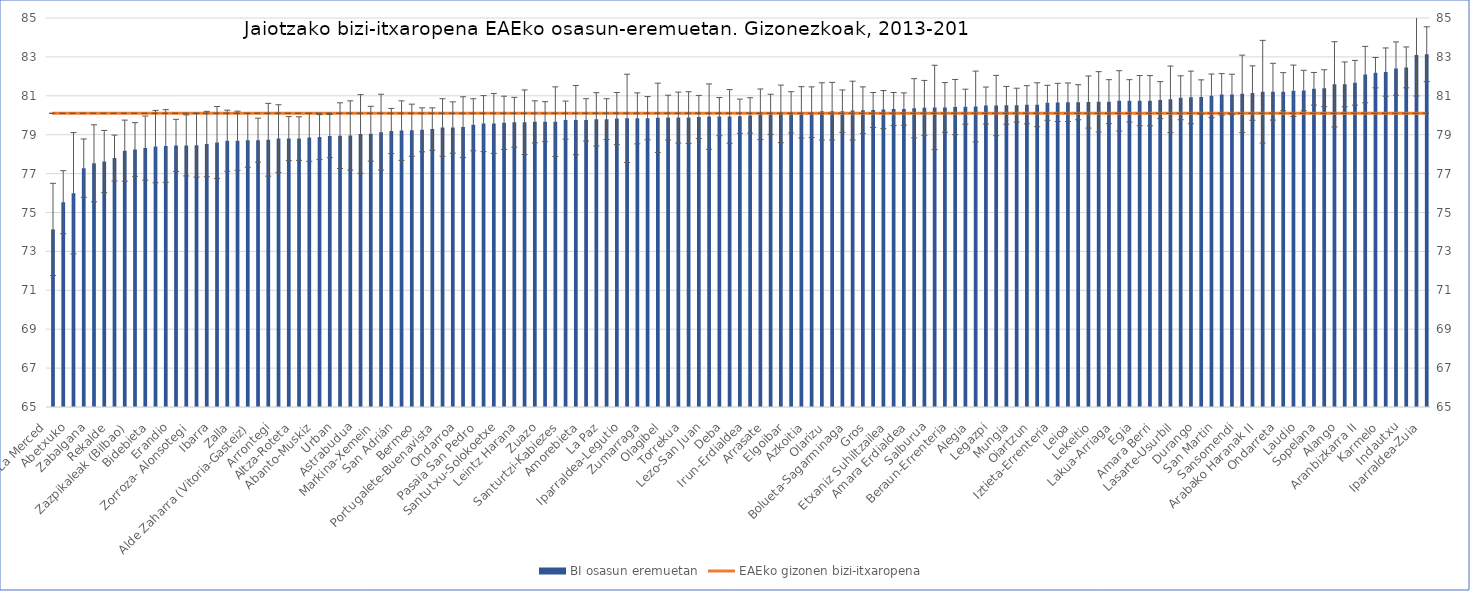
| Category | Osasun Eremua | BI osasun eremuetan |
|---|---|---|
| La Merced  | 0 | 74.13 |
| Miribilla  | 0 | 75.53 |
| Abetxuko  | 0 | 75.99 |
| Otxarkoaga  | 0 | 77.28 |
| Zabalgana  | 0 | 77.53 |
| Abusu  | 0 | 77.62 |
| Rekalde  | 0 | 77.8 |
| Larreagaburu  | 0 | 78.18 |
| Zazpikaleak (Bilbao)  | 0 | 78.24 |
| Pasaia Antxo  | 0 | 78.31 |
| Bidebieta  | 0 | 78.39 |
| Zaramaga  | 0 | 78.42 |
| Erandio  | 0 | 78.45 |
| Intxaurrondo  | 0 | 78.45 |
| Zorroza- Alonsotegi  | 0 | 78.46 |
| Lutxana  | 0 | 78.52 |
| Ibarra  | 0 | 78.6 |
| Sodupe-Gueñes  | 0 | 78.69 |
| Zalla  | 0 | 78.69 |
| Trapagaran  | 0 | 78.71 |
| Alde Zaharra (Vitoria-Gasteiz)  | 0 | 78.72 |
| Ortuella  | 0 | 78.74 |
| Arrontegi  | 0 | 78.8 |
| Tolosa  | 0 | 78.8 |
| Altza-Roteta  | 0 | 78.8 |
| Azpeitia  | 0 | 78.86 |
| Abanto-Muskiz  | 0 | 78.88 |
| Markonzaga  | 0 | 78.93 |
| Urban  | 0 | 78.95 |
| Loiola  | 0 | 78.96 |
| Astrabudua  | 0 | 79.04 |
| Villabona  | 0 | 79.05 |
| Markina-Xemein  | 0 | 79.13 |
| Santurtzi-Erdialdea-Mamariga  | 0 | 79.19 |
| San Adrián  | 0 | 79.21 |
| Ordizia  | 0 | 79.23 |
| Bermeo  | 0 | 79.25 |
| Zumaia-Zestoa-Getaria  | 0 | 79.29 |
| Portugalete-Buenavista  | 0 | 79.37 |
| Kueto  | 0 | 79.37 |
| Ondarroa  | 0 | 79.39 |
| Zaballa  | 0 | 79.51 |
| Pasaia San Pedro  | 0 | 79.57 |
| Arabako Errioxa  | 0 | 79.58 |
| Santutxu-Solokoetxe  | 0 | 79.61 |
| Txurdinaga  | 0 | 79.64 |
| Leintz Harana  | 0 | 79.64 |
| San Vicente  | 0 | 79.66 |
| Zuazo  | 0 | 79.67 |
| Begoña  | 0 | 79.67 |
| Santurtzi-Kabiezes  | 0 | 79.75 |
| Lazkao  | 0 | 79.75 |
| Amorebieta  | 0 | 79.76 |
| Arratia  | 0 | 79.79 |
| La Paz  | 0 | 79.8 |
| Balmaseda  | 0 | 79.83 |
| Iparraldea-Legutio  | 0 | 79.84 |
| Portugalete-Errepelega  | 0 | 79.84 |
| Zumarraga  | 0 | 79.85 |
| Zurbaran  | 0 | 79.87 |
| Olagibel  | 0 | 79.88 |
| Eibar  | 0 | 79.88 |
| Torrekua  | 0 | 79.88 |
| Basauri-Ariz  | 0 | 79.91 |
| Lezo-San Juan  | 0 | 79.93 |
| Dumboa  | 0 | 79.93 |
| Deba  | 0 | 79.94 |
| Hernani-Urnieta-Astigarraga  | 0 | 79.95 |
| Irun-Erdialdea  | 0 | 79.99 |
| Basauri-Kareaga  | 0 | 80.05 |
| Arrasate  | 0 | 80.05 |
| Etxebarri  | 0 | 80.07 |
| Elgoibar  | 0 | 80.15 |
| Andoain  | 0 | 80.15 |
| Azkoitia  | 0 | 80.16 |
| Hondarribia  | 0 | 80.2 |
| Olarizu  | 0 | 80.21 |
| Deustu  | 0 | 80.21 |
| Bolueta-Sagarminaga  | 0 | 80.24 |
| Gernika  | 0 | 80.26 |
| Gros  | 0 | 80.27 |
| Abadiño-Elorrio-Berriz  | 0 | 80.29 |
| Etxaniz Suhiltzailea  | 0 | 80.32 |
| Areeta  | 0 | 80.32 |
| Amara Erdialdea  | 0 | 80.36 |
| Gernikaldea  | 0 | 80.38 |
| Salburua  | 0 | 80.4 |
| Ermua  | 0 | 80.4 |
| Beraun-Errenteria  | 0 | 80.42 |
| Galdakao  | 0 | 80.44 |
| Alegia  | 0 | 80.45 |
| Aiala  | 0 | 80.5 |
| Legazpi  | 0 | 80.5 |
| Gazteleku  | 0 | 80.51 |
| Mungia  | 0 | 80.52 |
| Basurtu  | 0 | 80.54 |
| Oiartzun  | 0 | 80.54 |
| San Inazio  | 0 | 80.64 |
| Iztieta-Errenteria  | 0 | 80.66 |
| Portugalete-Castaños  | 0 | 80.67 |
| Leioa  | 0 | 80.67 |
| Javier Sáenz de Buruaga  | 0 | 80.68 |
| Lekeitio  | 0 | 80.69 |
| Bergara  | 0 | 80.7 |
| Lakua-Arriaga  | 0 | 80.74 |
| Txorierri  | 0 | 80.74 |
| Egia  | 0 | 80.75 |
| Alde Zaharra  | 0 | 80.75 |
| Amara Berri  | 0 | 80.78 |
| Aranbizkarra I  | 0 | 80.82 |
| Lasarte-Usurbil  | 0 | 80.9 |
| Arabako Lautada  | 0 | 80.92 |
| Durango  | 0 | 80.94 |
| Arrigorriaga  | 0 | 81 |
| San Martin  | 0 | 81.07 |
| Beasain  | 0 | 81.07 |
| Sansomendi  | 0 | 81.1 |
| Lakuabizkarra  | 0 | 81.14 |
| Arabako Haranak II  | 0 | 81.21 |
| Gorliz-Plentzia  | 0 | 81.21 |
| Ondarreta  | 0 | 81.21 |
| Oñati  | 0 | 81.26 |
| Laudio  | 0 | 81.27 |
| Zarautz-Orio-Aia  | 0 | 81.36 |
| Sopelana  | 0 | 81.39 |
| Arabako Haranak I  | 0 | 81.59 |
| Alango  | 0 | 81.59 |
| Gazalbide-Txagorritxu  | 0 | 81.67 |
| Aranbizkarra II  | 0 | 82.09 |
| Algorta  | 0 | 82.19 |
| Karmelo  | 0 | 82.22 |
| La Habana  | 0 | 82.4 |
| Indautxu  | 0 | 82.46 |
| Arabako Mendialdea  | 0 | 83.1 |
| Iparraldea-Zuia  | 0 | 83.14 |